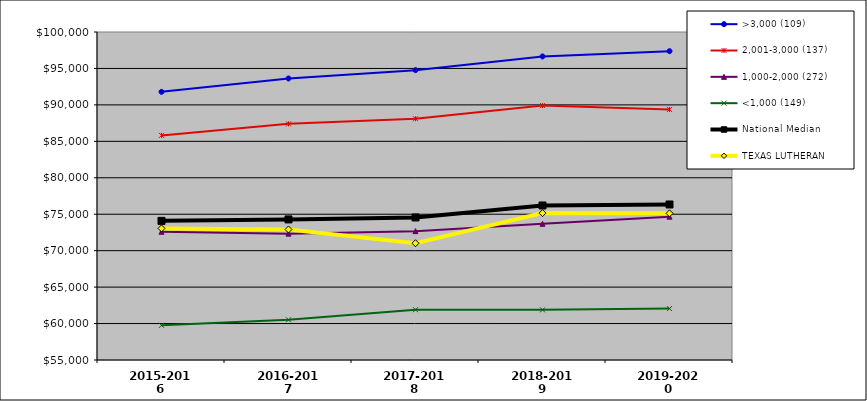
| Category | >3,000 (109) | 2,001-3,000 (137) | 1,000-2,000 (272) | <1,000 (149) | National Median | TEXAS LUTHERAN |
|---|---|---|---|---|---|---|
| 2015-2016 | 91791 | 85815 | 72594 | 59760 | 74088 | 73053 |
| 2016-2017 | 93625 | 87398 | 72333.5 | 60519 | 74288 | 72909 |
| 2017-2018 | 94768 | 88101 | 72680.5 | 61902 | 74555 | 71021 |
| 2018-2019 | 96647 | 89902 | 73686.5 | 61879 | 76199 | 75154 |
| 2019-2020 | 97370 | 89380 | 74666 | 62057 | 76337 | 75120 |